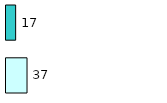
| Category | Series 0 | Series 1 |
|---|---|---|
| 0 | 37 | 17 |